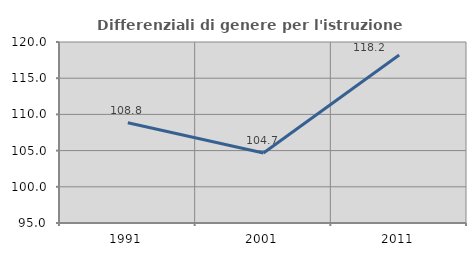
| Category | Differenziali di genere per l'istruzione superiore |
|---|---|
| 1991.0 | 108.845 |
| 2001.0 | 104.677 |
| 2011.0 | 118.217 |